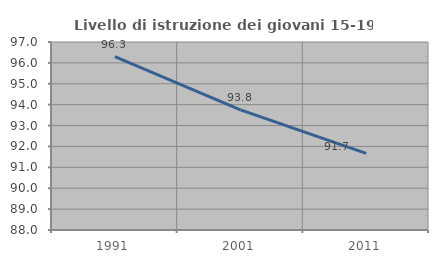
| Category | Livello di istruzione dei giovani 15-19 anni |
|---|---|
| 1991.0 | 96.296 |
| 2001.0 | 93.75 |
| 2011.0 | 91.667 |